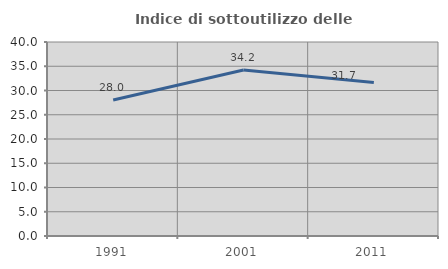
| Category | Indice di sottoutilizzo delle abitazioni  |
|---|---|
| 1991.0 | 28.044 |
| 2001.0 | 34.217 |
| 2011.0 | 31.651 |